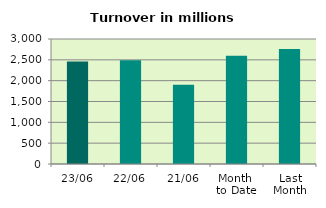
| Category | Series 0 |
|---|---|
| 23/06 | 2459.754 |
| 22/06 | 2491.061 |
| 21/06 | 1903.165 |
| Month 
to Date | 2599.599 |
| Last
Month | 2758.944 |